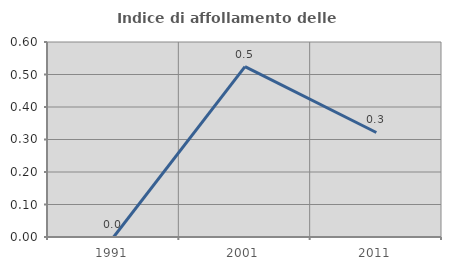
| Category | Indice di affollamento delle abitazioni  |
|---|---|
| 1991.0 | 0 |
| 2001.0 | 0.524 |
| 2011.0 | 0.322 |